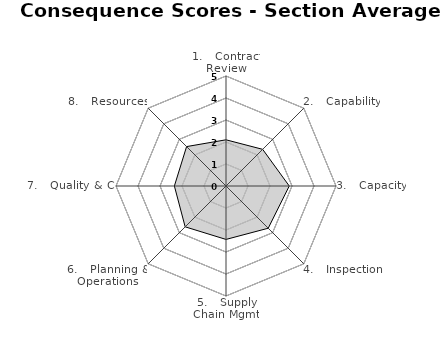
| Category | Series 0 |
|---|---|
| 1.   Contract Review | 2.1 |
| 2.   Capability | 2.357 |
| 3.   Capacity | 2.875 |
| 4.   Inspection  | 2.714 |
| 5.   Supply Chain Mgmt | 2.429 |
| 6.   Planning & Operations | 2.625 |
| 7.   Quality & CI | 2.346 |
| 8.   Resources | 2.533 |